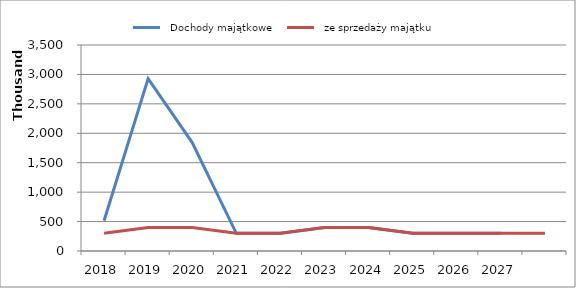
| Category |   Dochody majątkowe |   ze sprzedaży majątku |
|---|---|---|
| 2018.0 | 513374 | 300000 |
| 2019.0 | 2927822 | 400000 |
| 2020.0 | 1842182 | 400000 |
| 2021.0 | 300000 | 300000 |
| 2022.0 | 300000 | 300000 |
| 2023.0 | 400000 | 400000 |
| 2024.0 | 400000 | 400000 |
| 2025.0 | 300000 | 300000 |
| 2026.0 | 300000 | 300000 |
| 2027.0 | 300000 | 300000 |